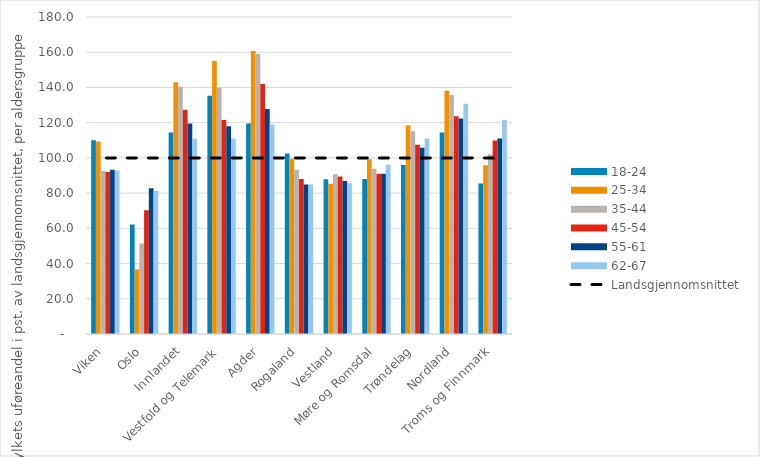
| Category | 18-24 | 25-34 | 35-44 | 45-54 | 55-61 | 62-67 |
|---|---|---|---|---|---|---|
| Viken | 110.029 | 109.261 | 92.611 | 91.918 | 93.33 | 92.787 |
| Oslo | 62.176 | 36.672 | 51.393 | 70.285 | 82.735 | 81.213 |
| Innlandet | 114.462 | 143.013 | 140.332 | 127.281 | 119.512 | 110.915 |
| Vestfold og Telemark | 135.309 | 155.15 | 139.871 | 121.564 | 117.909 | 110.953 |
| Agder | 119.596 | 160.751 | 159.053 | 142.019 | 127.745 | 118.91 |
| Rogaland | 102.487 | 99.537 | 93.26 | 88.058 | 84.822 | 84.909 |
| Vestland | 87.925 | 85.291 | 90.7 | 89.432 | 86.868 | 85.664 |
| Møre og Romsdal | 88.062 | 99.2 | 93.897 | 91.021 | 91.023 | 96.095 |
| Trøndelag | 95.91 | 118.493 | 115.191 | 107.449 | 105.786 | 111.041 |
| Nordland | 114.401 | 138.146 | 135.677 | 123.682 | 122.371 | 130.714 |
| Troms og Finnmark | 85.46 | 95.876 | 102.024 | 109.853 | 111 | 121.528 |